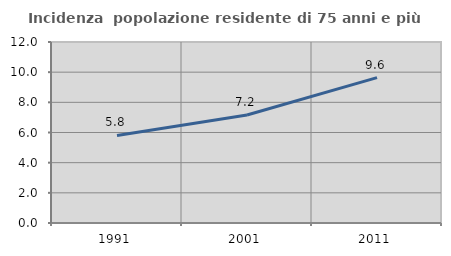
| Category | Incidenza  popolazione residente di 75 anni e più |
|---|---|
| 1991.0 | 5.804 |
| 2001.0 | 7.158 |
| 2011.0 | 9.642 |